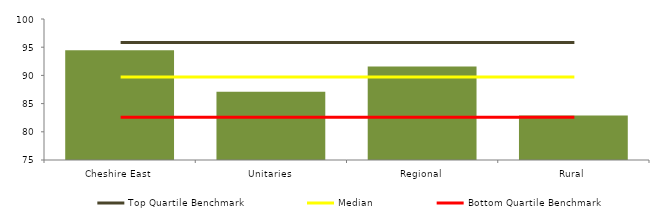
| Category | Block Data |
|---|---|
| Cheshire East | 94.444 |
| Unitaries | 87.081 |
| Regional | 91.577 |
|  Rural  | 82.902 |